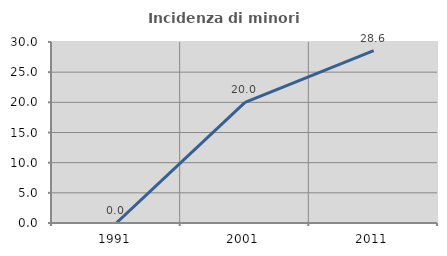
| Category | Incidenza di minori stranieri |
|---|---|
| 1991.0 | 0 |
| 2001.0 | 20 |
| 2011.0 | 28.571 |